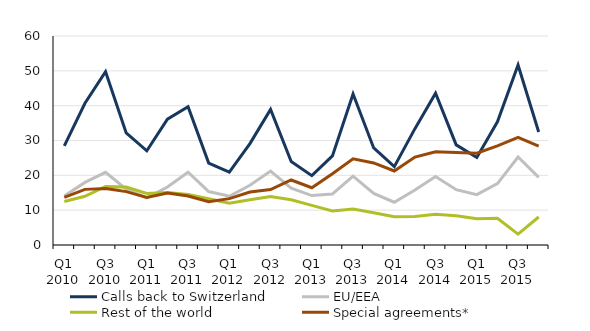
| Category | Calls back to Switzerland  | EU/EEA | Rest of the world | Special agreements* |
|---|---|---|---|---|
| Q1 2010 | 28.477 | 14.043 | 12.489 | 13.652 |
| Q2 2010 | 40.682 | 17.976 | 13.986 | 15.97 |
| Q3 2010 | 49.76 | 20.857 | 16.822 | 16.244 |
| Q4 2010 | 32.182 | 16.05 | 16.647 | 15.322 |
| Q1 2011 | 27.028 | 13.521 | 14.802 | 13.655 |
| Q2 2011 | 36.123 | 16.639 | 15.063 | 14.947 |
| Q3 2011 | 39.695 | 20.905 | 14.504 | 14.061 |
| Q4 2011 | 23.538 | 15.355 | 13.262 | 12.398 |
| Q1 2012 | 20.928 | 14.002 | 12.014 | 13.307 |
| Q2 2012 | 29.105 | 17.135 | 12.979 | 15.196 |
| Q3 2012 | 38.934 | 21.224 | 13.948 | 15.909 |
| Q4 2012 | 23.94 | 16.329 | 13.001 | 18.661 |
| Q1 2013 | 19.918 | 14.191 | 11.39 | 16.433 |
| Q2 2013 | 25.585 | 14.657 | 9.773 | 20.455 |
| Q3 2013 | 43.334 | 19.779 | 10.348 | 24.744 |
| Q4 2013 | 27.865 | 14.812 | 9.282 | 23.559 |
| Q1 2014 | 22.49 | 12.275 | 8.142 | 21.246 |
| Q2 2014 | 33.407 | 15.78 | 8.206 | 25.237 |
| Q3 2014 | 43.568 | 19.644 | 8.861 | 26.774 |
| Q4 2014 | 28.737 | 15.874 | 8.377 | 26.556 |
| Q1 2015 | 25.115 | 14.452 | 7.557 | 26.365 |
| Q2 2015 | 35.362 | 17.622 | 7.694 | 28.469 |
| Q3 2015 | 51.661 | 25.26 | 3.124 | 30.91 |
| Q4 2015 | 32.442 | 19.399 | 8.036 | 28.397 |